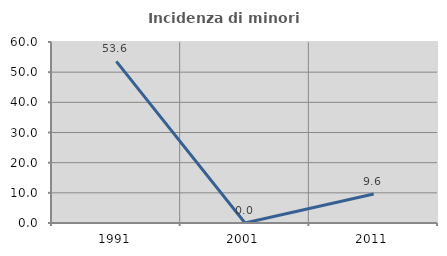
| Category | Incidenza di minori stranieri |
|---|---|
| 1991.0 | 53.571 |
| 2001.0 | 0 |
| 2011.0 | 9.639 |